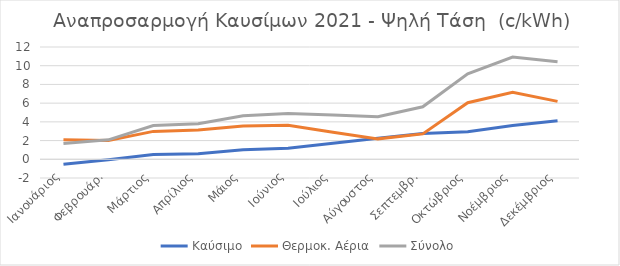
| Category | Καύσιμο | Θερμοκ. Αέρια | Σύνολο |
|---|---|---|---|
| Ιανουάριος | -0.54 | 2.099 | 1.687 |
| Φεβρουάρ. | -0.057 | 2.013 | 2.078 |
| Μάρτιος | 0.518 | 2.981 | 3.601 |
| Απρίλιος | 0.585 | 3.118 | 3.801 |
| Μάιος | 1.019 | 3.569 | 4.657 |
| Ιούνιος | 1.185 | 3.624 | 4.882 |
| Ιούλιος | 1.724 | 2.896 | 4.741 |
| Αύγουστος | 2.249 | 2.182 | 4.544 |
| Σεπτεμβρ. | 2.769 | 2.715 | 5.612 |
| Οκτώβριος | 2.954 | 6.045 | 9.129 |
| Νοέμβριος | 3.622 | 7.163 | 10.919 |
| Δεκέμβριος | 4.113 | 6.188 | 10.431 |